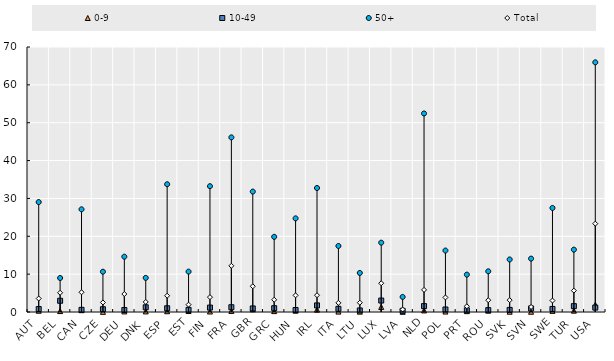
| Category | 0-9 | 10-49 | 50+ | Total |
|---|---|---|---|---|
| AUT | 0.333 | 0.781 | 29.037 | 3.559 |
| BEL | 0.247 | 2.969 | 8.983 | 5.088 |
| CAN | 0.48 | 0.571 | 27.123 | 5.212 |
| CZE | 0.045 | 0.735 | 10.64 | 2.515 |
| DEU | 0.154 | 0.522 | 14.612 | 4.748 |
| DNK | 0.16 | 1.243 | 9.017 | 2.658 |
| ESP | 0.205 | 0.984 | 33.749 | 4.296 |
| EST | 0.26 | 0.569 | 10.665 | 1.941 |
| FIN | 0.133 | 1.162 | 33.236 | 3.931 |
| FRA | 0.285 | 1.263 | 46.126 | 12.205 |
| GBR | 0.706 | 0.942 | 31.808 | 6.795 |
| GRC | 0.233 | 1.005 | 19.857 | 3.237 |
| HUN | 0.35 | 0.527 | 24.736 | 4.397 |
| IRL | 0.627 | 1.744 | 32.755 | 4.436 |
| ITA | 0.11 | 0.842 | 17.445 | 2.417 |
| LTU | 0.097 | 0.412 | 10.313 | 2.464 |
| LUX | 1.333 | 3.028 | 18.313 | 7.598 |
| LVA | 0.05 | 0.307 | 3.981 | 0.662 |
| NLD | 0.417 | 1.557 | 52.442 | 5.843 |
| POL | 0.122 | 0.661 | 16.235 | 3.844 |
| PRT | 0.224 | 0.456 | 9.875 | 1.51 |
| ROU | 0.359 | 0.489 | 10.747 | 3.119 |
| SVK | 0.082 | 0.553 | 13.878 | 3.138 |
| SVN | 0.073 | 0.942 | 14.102 | 1.338 |
| SWE | 0.298 | 0.808 | 27.486 | 3.022 |
| TUR | 0.355 | 1.555 | 16.468 | 5.652 |
| USA | 1.908 | 1.165 | 65.953 | 23.332 |